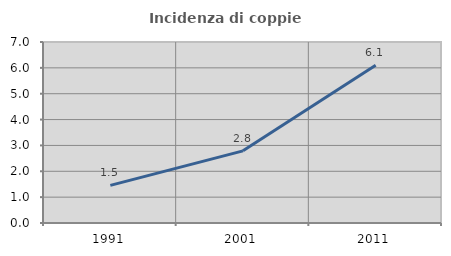
| Category | Incidenza di coppie miste |
|---|---|
| 1991.0 | 1.457 |
| 2001.0 | 2.791 |
| 2011.0 | 6.097 |